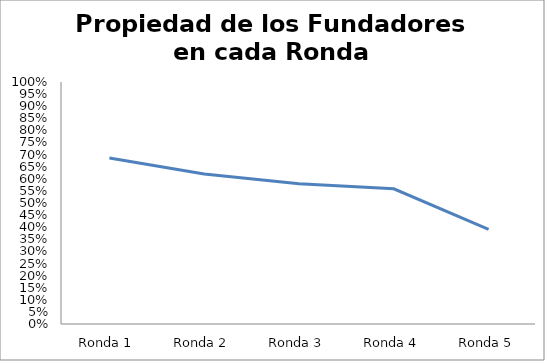
| Category | Series 0 |
|---|---|
| Ronda 1 | 0.686 |
| Ronda 2 | 0.62 |
| Ronda 3 | 0.58 |
| Ronda 4 | 0.559 |
| Ronda 5 | 0.391 |